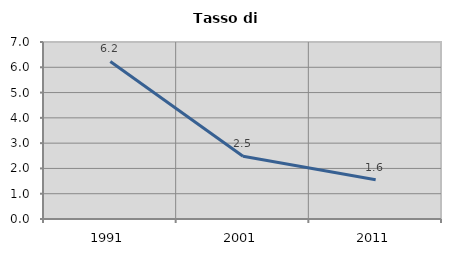
| Category | Tasso di disoccupazione   |
|---|---|
| 1991.0 | 6.229 |
| 2001.0 | 2.483 |
| 2011.0 | 1.551 |